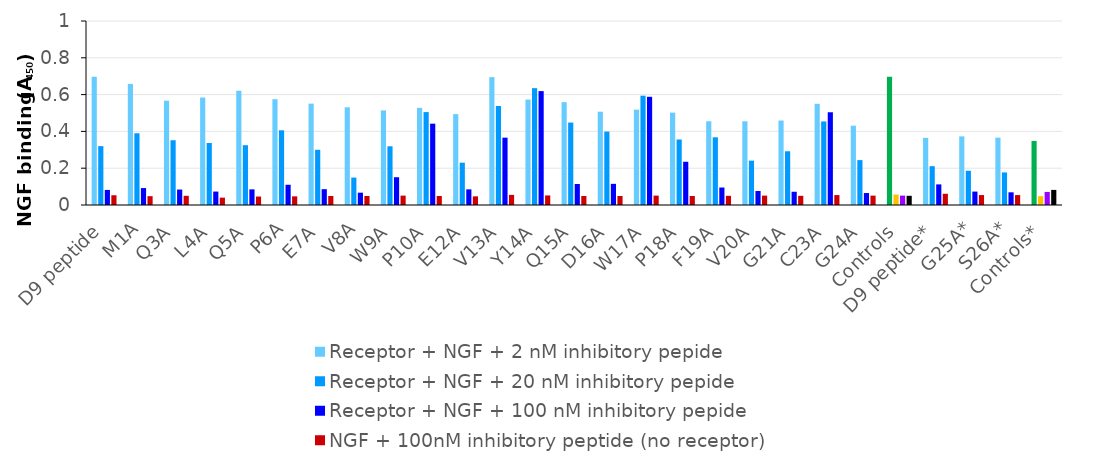
| Category | Receptor + NGF + 2 nM inhibitory pepide | Receptor + NGF + 20 nM inhibitory pepide | Receptor + NGF + 100 nM inhibitory pepide | NGF + 100nM inhibitory peptide (no receptor) |
|---|---|---|---|---|
| D9 peptide | 0.697 | 0.32 | 0.082 | 0.053 |
| M1A | 0.658 | 0.39 | 0.092 | 0.048 |
| Q3A | 0.567 | 0.352 | 0.084 | 0.05 |
| L4A | 0.584 | 0.337 | 0.073 | 0.04 |
| Q5A | 0.621 | 0.325 | 0.085 | 0.046 |
| P6A | 0.575 | 0.406 | 0.11 | 0.047 |
| E7A | 0.551 | 0.3 | 0.086 | 0.049 |
| V8A | 0.531 | 0.149 | 0.067 | 0.049 |
| W9A | 0.514 | 0.319 | 0.151 | 0.051 |
| P10A | 0.528 | 0.505 | 0.442 | 0.049 |
| E12A | 0.494 | 0.23 | 0.085 | 0.047 |
| V13A | 0.695 | 0.538 | 0.366 | 0.055 |
| Y14A | 0.573 | 0.635 | 0.619 | 0.052 |
| Q15A | 0.559 | 0.448 | 0.114 | 0.049 |
| D16A | 0.507 | 0.399 | 0.115 | 0.049 |
| W17A | 0.518 | 0.594 | 0.588 | 0.051 |
| P18A | 0.502 | 0.356 | 0.235 | 0.049 |
| F19A | 0.455 | 0.368 | 0.095 | 0.05 |
| V20A | 0.455 | 0.241 | 0.076 | 0.051 |
| G21A | 0.459 | 0.292 | 0.072 | 0.05 |
| C23A | 0.55 | 0.454 | 0.504 | 0.054 |
| G24A | 0.431 | 0.244 | 0.065 | 0.051 |
| Controls | 0.697 | 0.057 | 0.051 | 0.05 |
| D9 peptide* | 0.365 | 0.211 | 0.112 | 0.061 |
| G25A* | 0.373 | 0.186 | 0.073 | 0.054 |
| S26A* | 0.366 | 0.177 | 0.069 | 0.054 |
| Controls* | 0.348 | 0.048 | 0.071 | 0.082 |